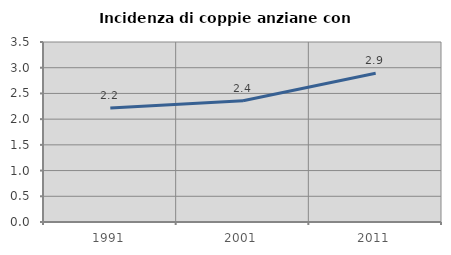
| Category | Incidenza di coppie anziane con figli |
|---|---|
| 1991.0 | 2.218 |
| 2001.0 | 2.358 |
| 2011.0 | 2.893 |